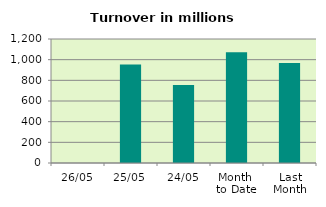
| Category | Series 0 |
|---|---|
| 26/05 | 0 |
| 25/05 | 952.708 |
| 24/05 | 754.394 |
| Month 
to Date | 1070.677 |
| Last
Month | 968.247 |